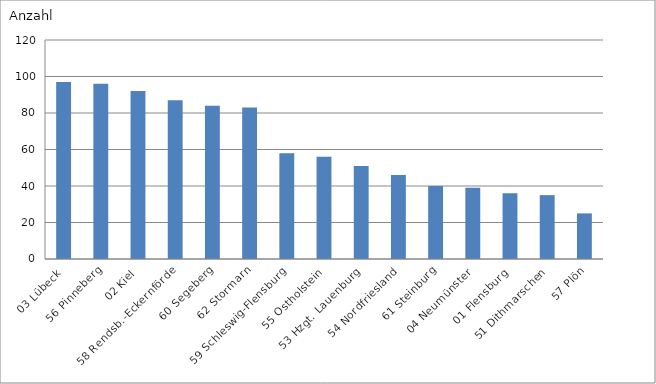
| Category | 03 Lübeck |
|---|---|
| 03 Lübeck | 97 |
| 56 Pinneberg | 96 |
| 02 Kiel | 92 |
| 58 Rendsb.-Eckernförde | 87 |
| 60 Segeberg | 84 |
| 62 Stormarn | 83 |
| 59 Schleswig-Flensburg | 58 |
| 55 Ostholstein | 56 |
| 53 Hzgt. Lauenburg | 51 |
| 54 Nordfriesland | 46 |
| 61 Steinburg | 40 |
| 04 Neumünster | 39 |
| 01 Flensburg | 36 |
| 51 Dithmarschen | 35 |
| 57 Plön | 25 |